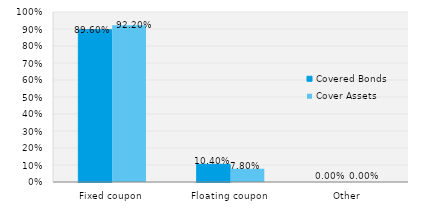
| Category | Covered Bonds | Cover Assets |
|---|---|---|
| Fixed coupon | 0.896 | 0.922 |
| Floating coupon | 0.104 | 0.078 |
| Other | 0 | 0 |